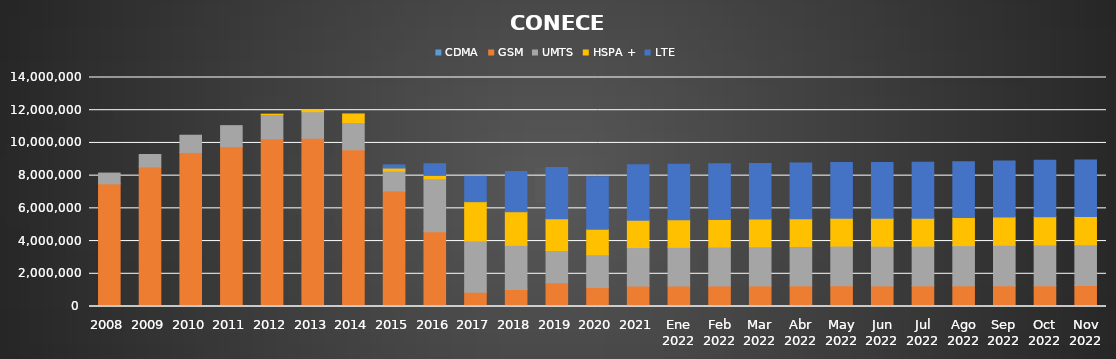
| Category | CDMA | GSM | UMTS | HSPA + | LTE |
|---|---|---|---|---|---|
| 2008 | 0 | 7499370 | 656989 | 0 | 0 |
| 2009 | 0 | 8532691 | 758577 | 0 | 0 |
| 2010 | 0 | 9419193 | 1051309 | 0 | 0 |
| 2011 | 0 | 9774865 | 1282451 | 0 | 0 |
| 2012 | 0 | 10252457 | 1484003 | 21446 | 0 |
| 2013 | 0 | 10287259 | 1622034 | 121593 | 0 |
| 2014 | 0 | 9581956 | 1664758 | 525306 | 0 |
| 2015 | 0 | 7065313 | 1214567 | 183109 | 195630 |
| 2016 | 0 | 4571999 | 3240700 | 201567 | 712557 |
| 2017 | 0 | 873346 | 3135577 | 2399460 | 1551880 |
| 2018 | 0 | 1039373 | 2706058 | 2049418 | 2453201 |
| 2019 | 0 | 1452334 | 1970422 | 1937931 | 3132367 |
| 2020 | 0 | 1158751 | 2009264 | 1548440 | 3212798 |
| 2021 | 0 | 1250925 | 2353798 | 1675346 | 3385646 |
| Ene 2022 | 0 | 1253803 | 2367204 | 1682872 | 3391452 |
| Feb 2022 | 0 | 1256245 | 2379435 | 1688963 | 3397299 |
| Mar 2022 | 0 | 1259631 | 2392596 | 1693034 | 3401696 |
| Abr 2022 | 0 | 1264438 | 2406911 | 1697322 | 3404685 |
| May 2022 | 0 | 1270140 | 2426173 | 1703122 | 3410983 |
| Jun 2022 | 0 | 1262085 | 2423097 | 1704279 | 3412930 |
| Jul 2022 | 0 | 1263792 | 2429301 | 1706746 | 3411593 |
| Ago 2022 | 0 | 1267014 | 2455439 | 1715007 | 3418449 |
| Sep 2022 | 0 | 1270438 | 2475907 | 1721545 | 3432386 |
| Oct 2022 | 0 | 1275144 | 2489198 | 1726043 | 3448215 |
| Nov 2022 | 0 | 1277149 | 2498672 | 1730028 | 3453887 |